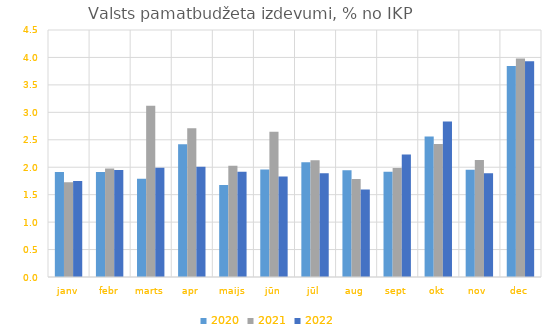
| Category | 2020 | 2021 | 2022 |
|---|---|---|---|
| janv | 1.914 | 1.727 | 1.748 |
| febr | 1.912 | 1.976 | 1.951 |
| marts | 1.791 | 3.118 | 1.99 |
| apr | 2.419 | 2.71 | 2.009 |
| maijs | 1.676 | 2.028 | 1.918 |
| jūn | 1.959 | 2.644 | 1.83 |
| jūl | 2.088 | 2.125 | 1.891 |
| aug | 1.945 | 1.787 | 1.595 |
| sept | 1.917 | 1.987 | 2.23 |
| okt | 2.561 | 2.421 | 2.834 |
| nov | 1.954 | 2.13 | 1.89 |
| dec | 3.844 | 3.981 | 3.931 |